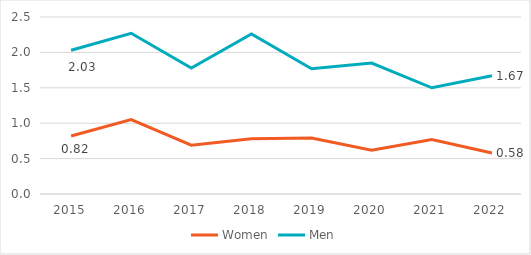
| Category | Women | Men |
|---|---|---|
| 2015.0 | 0.82 | 2.03 |
| 2016.0 | 1.05 | 2.27 |
| 2017.0 | 0.69 | 1.78 |
| 2018.0 | 0.78 | 2.26 |
| 2019.0 | 0.79 | 1.77 |
| 2020.0 | 0.62 | 1.85 |
| 2021.0 | 0.77 | 1.5 |
| 2022.0 | 0.58 | 1.67 |